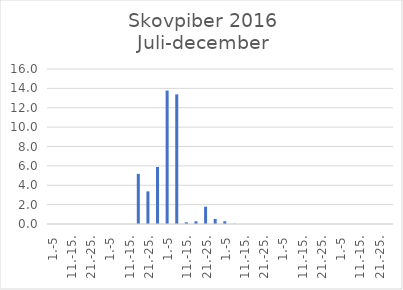
| Category | Series 0 |
|---|---|
| 1.-5 | 0 |
| 6.-10. | 0 |
| 11.-15. | 0 |
| 16.-20. | 0 |
| 21.-25. | 0 |
| 26.-31. | 0 |
| 1.-5 | 0 |
| 6.-10. | 0 |
| 11.-15. | 0 |
| 16.-20. | 5.175 |
| 21.-25. | 3.371 |
| 26.-31. | 5.889 |
| 1.-5 | 13.773 |
| 6.-10. | 13.38 |
| 11.-15. | 0.174 |
| 16.-20. | 0.28 |
| 21.-25. | 1.791 |
| 26.-30. | 0.516 |
| 1.-5 | 0.284 |
| 6.-10. | 0.024 |
| 11.-15. | 0 |
| 16.-20. | 0 |
| 21.-25. | 0 |
| 26.-31. | 0 |
| 1.-5 | 0 |
| 6.-10. | 0 |
| 11.-15. | 0 |
| 16.-20. | 0 |
| 21.-25. | 0 |
| 26.-30. | 0 |
| 1.-5 | 0 |
| 6.-10. | 0 |
| 11.-15. | 0 |
| 16.-20. | 0 |
| 21.-25. | 0 |
| 26.-31. | 0 |